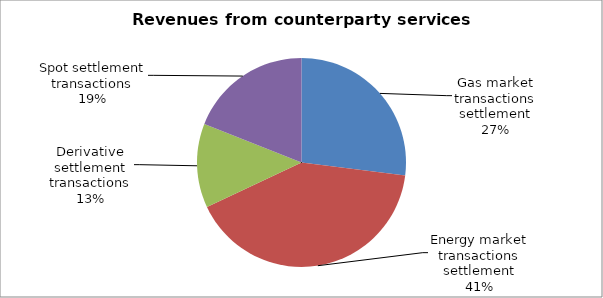
| Category | Series 0 |
|---|---|
| Gas market transactions settlement | 0.27 |
| Energy market transactions settlement | 0.41 |
| Derivative settlement transactions | 0.13 |
| Spot settlement transactions | 0.19 |